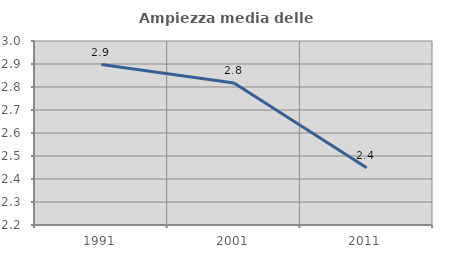
| Category | Ampiezza media delle famiglie |
|---|---|
| 1991.0 | 2.897 |
| 2001.0 | 2.817 |
| 2011.0 | 2.449 |